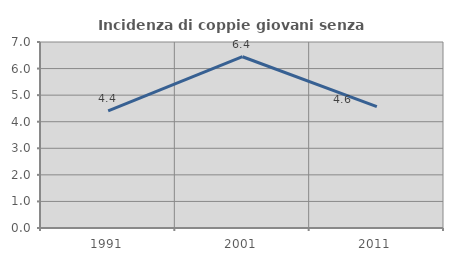
| Category | Incidenza di coppie giovani senza figli |
|---|---|
| 1991.0 | 4.409 |
| 2001.0 | 6.446 |
| 2011.0 | 4.567 |